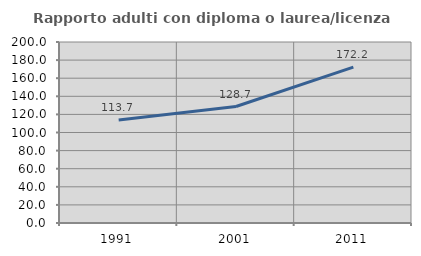
| Category | Rapporto adulti con diploma o laurea/licenza media  |
|---|---|
| 1991.0 | 113.725 |
| 2001.0 | 128.689 |
| 2011.0 | 172.157 |